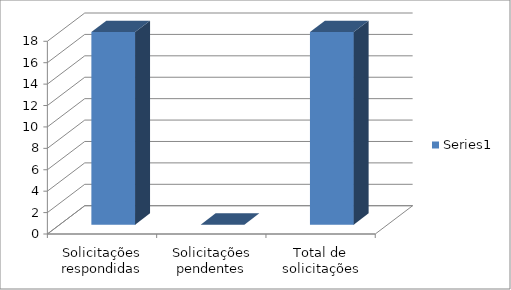
| Category | Series 0 |
|---|---|
| Solicitações respondidas | 18 |
| Solicitações pendentes | 0 |
| Total de solicitações | 18 |